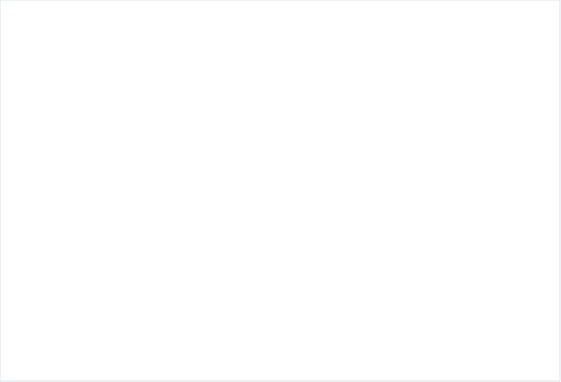
| Category | Suma de CXP CONSTITUIDAS
(1) | Suma de CANCELACIONES CXP
 (2) | Suma de TOTAL PAGOS
ACUMULADOS
(5) |
|---|---|---|---|
| Total | 8076.214 | 0 | 2555.619 |